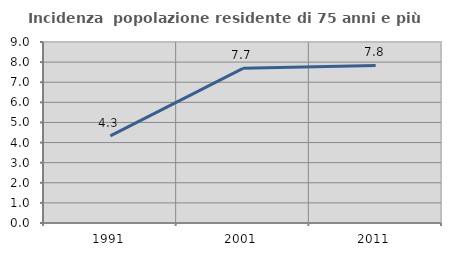
| Category | Incidenza  popolazione residente di 75 anni e più |
|---|---|
| 1991.0 | 4.337 |
| 2001.0 | 7.69 |
| 2011.0 | 7.836 |